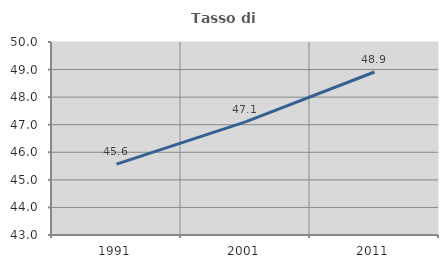
| Category | Tasso di occupazione   |
|---|---|
| 1991.0 | 45.569 |
| 2001.0 | 47.104 |
| 2011.0 | 48.912 |